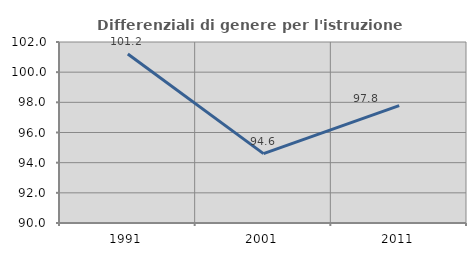
| Category | Differenziali di genere per l'istruzione superiore |
|---|---|
| 1991.0 | 101.21 |
| 2001.0 | 94.601 |
| 2011.0 | 97.776 |